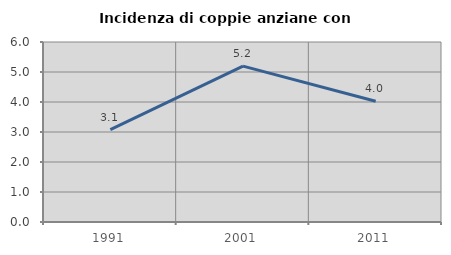
| Category | Incidenza di coppie anziane con figli |
|---|---|
| 1991.0 | 3.077 |
| 2001.0 | 5.195 |
| 2011.0 | 4.027 |